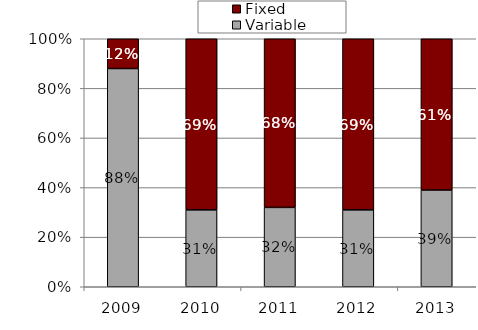
| Category | Variable | Fixed |
|---|---|---|
| 2009.0 | 0.88 | 0.12 |
| 2010.0 | 0.31 | 0.69 |
| 2011.0 | 0.32 | 0.68 |
| 2012.0 | 0.31 | 0.69 |
| 2013.0 | 0.39 | 0.61 |